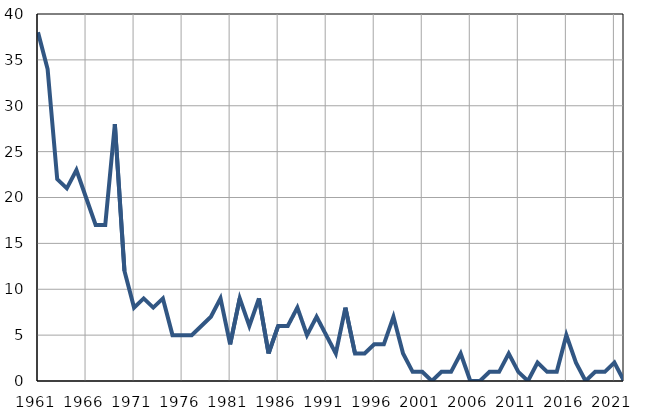
| Category | Infants
deaths |
|---|---|
| 1961.0 | 38 |
| 1962.0 | 34 |
| 1963.0 | 22 |
| 1964.0 | 21 |
| 1965.0 | 23 |
| 1966.0 | 20 |
| 1967.0 | 17 |
| 1968.0 | 17 |
| 1969.0 | 28 |
| 1970.0 | 12 |
| 1971.0 | 8 |
| 1972.0 | 9 |
| 1973.0 | 8 |
| 1974.0 | 9 |
| 1975.0 | 5 |
| 1976.0 | 5 |
| 1977.0 | 5 |
| 1978.0 | 6 |
| 1979.0 | 7 |
| 1980.0 | 9 |
| 1981.0 | 4 |
| 1982.0 | 9 |
| 1983.0 | 6 |
| 1984.0 | 9 |
| 1985.0 | 3 |
| 1986.0 | 6 |
| 1987.0 | 6 |
| 1988.0 | 8 |
| 1989.0 | 5 |
| 1990.0 | 7 |
| 1991.0 | 5 |
| 1992.0 | 3 |
| 1993.0 | 8 |
| 1994.0 | 3 |
| 1995.0 | 3 |
| 1996.0 | 4 |
| 1997.0 | 4 |
| 1998.0 | 7 |
| 1999.0 | 3 |
| 2000.0 | 1 |
| 2001.0 | 1 |
| 2002.0 | 0 |
| 2003.0 | 1 |
| 2004.0 | 1 |
| 2005.0 | 3 |
| 2006.0 | 0 |
| 2007.0 | 0 |
| 2008.0 | 1 |
| 2009.0 | 1 |
| 2010.0 | 3 |
| 2011.0 | 1 |
| 2012.0 | 0 |
| 2013.0 | 2 |
| 2014.0 | 1 |
| 2015.0 | 1 |
| 2016.0 | 5 |
| 2017.0 | 2 |
| 2018.0 | 0 |
| 2019.0 | 1 |
| 2020.0 | 1 |
| 2021.0 | 2 |
| 2022.0 | 0 |